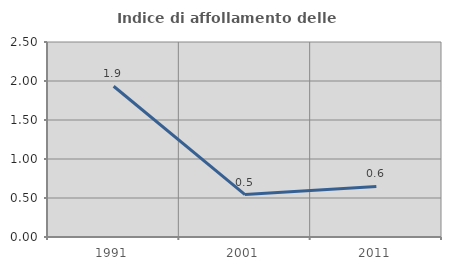
| Category | Indice di affollamento delle abitazioni  |
|---|---|
| 1991.0 | 1.933 |
| 2001.0 | 0.544 |
| 2011.0 | 0.648 |